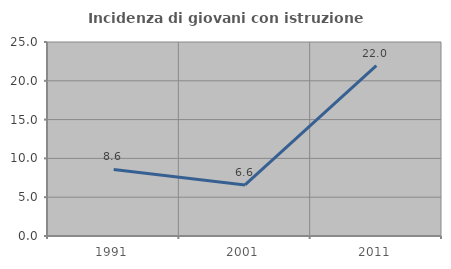
| Category | Incidenza di giovani con istruzione universitaria |
|---|---|
| 1991.0 | 8.571 |
| 2001.0 | 6.587 |
| 2011.0 | 21.965 |